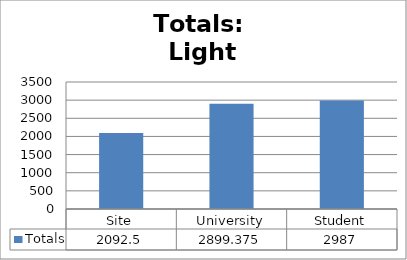
| Category | Totals |
|---|---|
| Site | 2092.5 |
| University | 2899.375 |
| Student | 2987 |